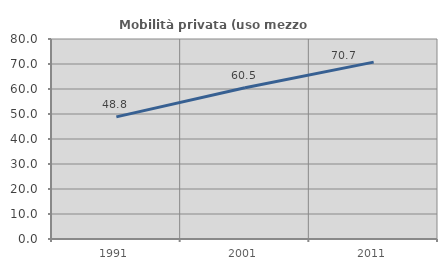
| Category | Mobilità privata (uso mezzo privato) |
|---|---|
| 1991.0 | 48.837 |
| 2001.0 | 60.471 |
| 2011.0 | 70.742 |